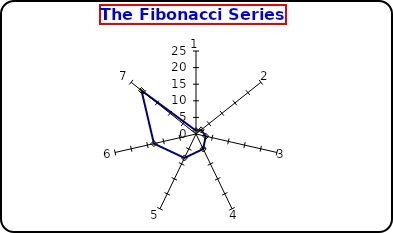
| Category | Series 0 |
|---|---|
| 0 | 1 |
| 1 | 2 |
| 2 | 3 |
| 3 | 5 |
| 4 | 8 |
| 5 | 13 |
| 6 | 21 |